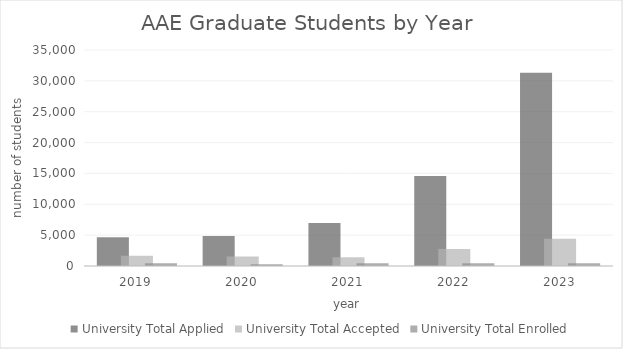
| Category | University Total |
|---|---|
| 2019.0 | 448 |
| 2020.0 | 298 |
| 2021.0 | 446 |
| 2022.0 | 462 |
| 2023.0 | 436 |